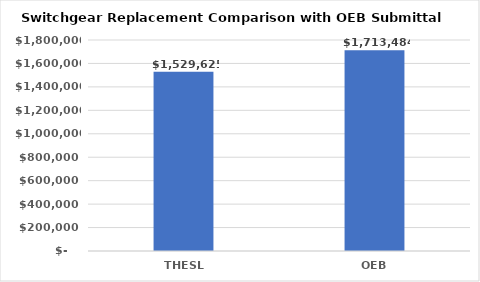
| Category | Series 0 |
|---|---|
| THESL | 1529625 |
| OEB | 1713484 |